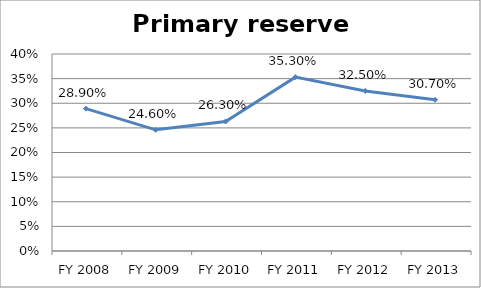
| Category | Primary reserve ratio |
|---|---|
| FY 2013 | 0.307 |
| FY 2012 | 0.325 |
| FY 2011 | 0.353 |
| FY 2010 | 0.263 |
| FY 2009 | 0.246 |
| FY 2008 | 0.289 |